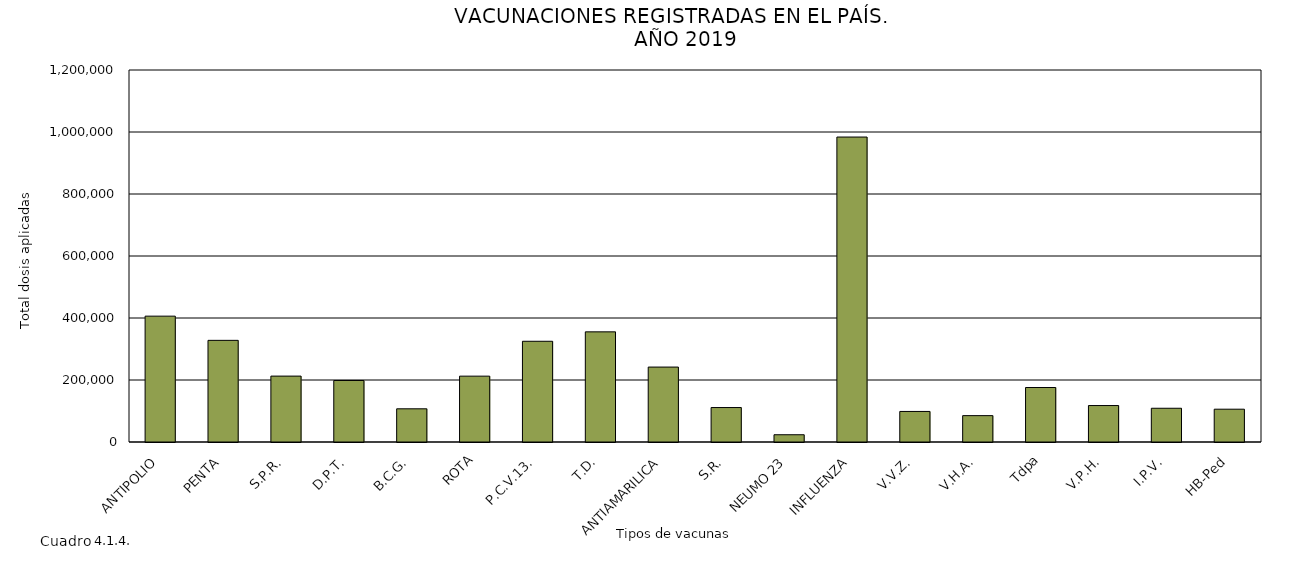
| Category | 2019 |
|---|---|
| ANTIPOLIO | 405959 |
| PENTA | 327883 |
| S.P.R. | 212558 |
| D.P.T. | 198414 |
| B.C.G. | 107057 |
| ROTA | 212429 |
| P.C.V.13. | 324926 |
| T.D. | 355329 |
| ANTIAMARILICA | 241722 |
| S.R. | 111173 |
| NEUMO 23 | 23423 |
| INFLUENZA | 983722 |
| V.V.Z. | 98540 |
| V.H.A. | 85057 |
| Tdpa | 175790 |
| V.P.H. | 117609 |
| I.P.V. | 108835 |
| HB-Ped | 105845 |